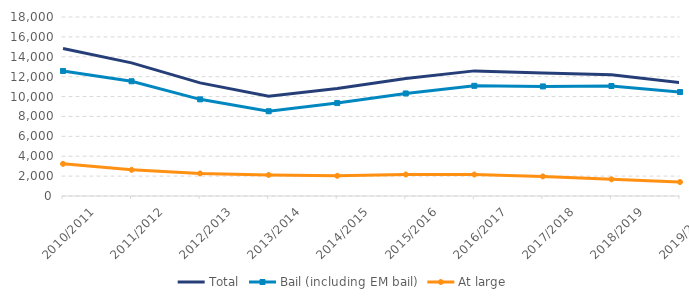
| Category | Total | Bail (including EM bail) | At large |
|---|---|---|---|
| 2010/2011 | 14839 | 12572 | 3233 |
| 2011/2012 | 13385 | 11538 | 2634 |
| 2012/2013 | 11374 | 9721 | 2266 |
| 2013/2014 | 10043 | 8523 | 2115 |
| 2014/2015 | 10801 | 9345 | 2031 |
| 2015/2016 | 11811 | 10312 | 2161 |
| 2016/2017 | 12582 | 11081 | 2159 |
| 2017/2018 | 12367 | 11018 | 1972 |
| 2018/2019 | 12202 | 11064 | 1678 |
| 2019/2020 | 11406 | 10452 | 1405 |